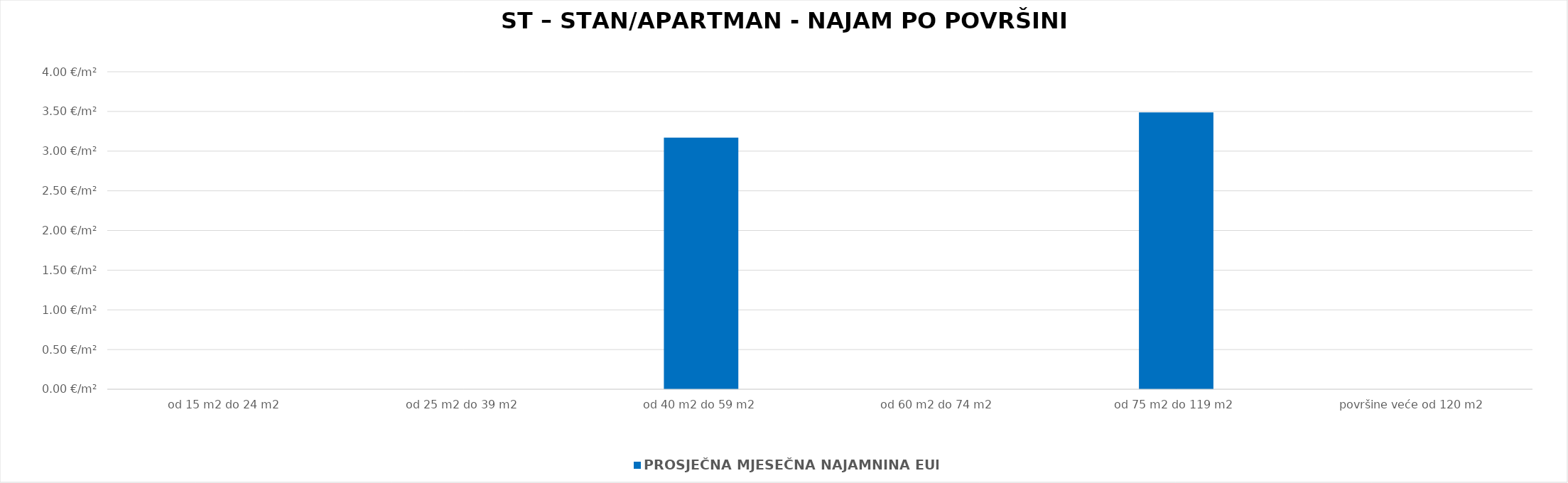
| Category | PROSJEČNA MJESEČNA NAJAMNINA EUR/m² |
|---|---|
| od 15 m2 do 24 m2 | 0 |
| od 25 m2 do 39 m2 | 0 |
| od 40 m2 do 59 m2 | 1900-01-03 04:03:30 |
| od 60 m2 do 74 m2 | 0 |
| od 75 m2 do 119 m2 | 1900-01-03 11:42:02 |
| površine veće od 120 m2 | 0 |